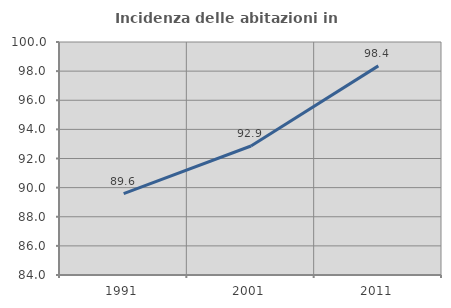
| Category | Incidenza delle abitazioni in proprietà  |
|---|---|
| 1991.0 | 89.583 |
| 2001.0 | 92.857 |
| 2011.0 | 98.361 |